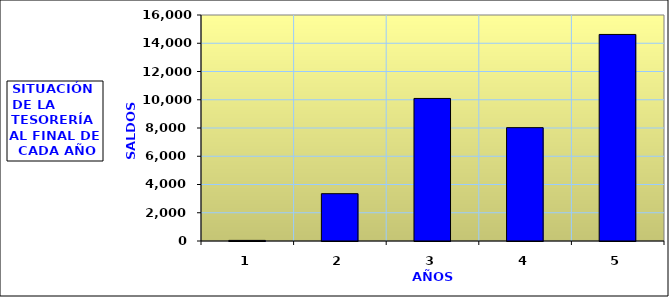
| Category | Series 0 |
|---|---|
| 0 | 42.6 |
| 1 | 3349.798 |
| 2 | 10092.554 |
| 3 | 8025.883 |
| 4 | 14622.833 |